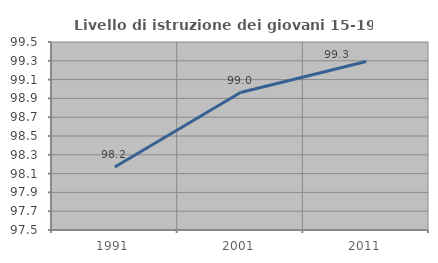
| Category | Livello di istruzione dei giovani 15-19 anni |
|---|---|
| 1991.0 | 98.169 |
| 2001.0 | 98.962 |
| 2011.0 | 99.292 |